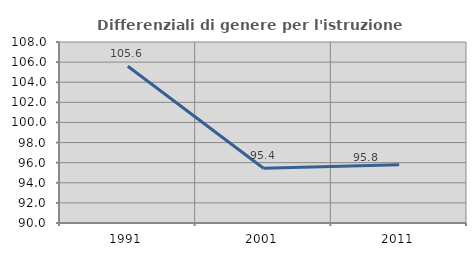
| Category | Differenziali di genere per l'istruzione superiore |
|---|---|
| 1991.0 | 105.584 |
| 2001.0 | 95.447 |
| 2011.0 | 95.805 |